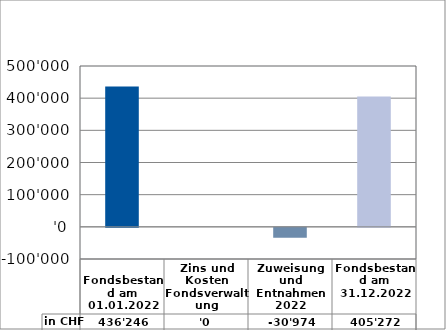
| Category | in CHF |
|---|---|
| 
Fondsbestand am 01.01.2022

 | 436246.05 |
| Zins und Kosten Fondsverwaltung | 0 |
| Zuweisung und Entnahmen 2022 | -30974.2 |
| Fondsbestand am 31.12.2022 | 405271.85 |